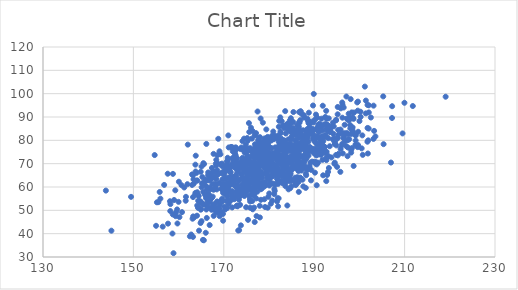
| Category | Series 0 |
|---|---|
| 181.97354789290594 | 63.013 |
| 174.14995070958344 | 69.719 |
| 190.10420089350603 | 84.557 |
| 165.58429628779334 | 37.166 |
| 183.79218251577453 | 74.781 |
| 199.11801189327667 | 78.111 |
| 182.34821796358167 | 75.949 |
| 166.06781007941893 | 55.224 |
| 172.21955185147635 | 71.529 |
| 181.12166712556677 | 82.031 |
| 188.08971407539184 | 74.369 |
| 176.67147041239792 | 75.014 |
| 176.12724490690118 | 67.232 |
| 177.76762304990046 | 78.871 |
| 170.2322964658713 | 68.976 |
| 179.8002262728901 | 78.485 |
| 177.11377312325243 | 64.06 |
| 164.51959254714086 | 41.301 |
| 171.89142333474146 | 55.757 |
| 186.341624362635 | 71.644 |
| 187.97718547556184 | 73.834 |
| 177.0613540110579 | 70.189 |
| 158.08883387889315 | 53.896 |
| 203.2528463055293 | 84.05 |
| 175.3363432921299 | 76.392 |
| 181.52351085125727 | 68.783 |
| 169.47795082283443 | 54.198 |
| 179.49615841966119 | 71.707 |
| 176.81316132929575 | 62.189 |
| 161.6260778254142 | 55.792 |
| 177.46580289804268 | 62.531 |
| 192.3760925088205 | 81.652 |
| 182.4824727362719 | 71.401 |
| 183.82412955635132 | 65.702 |
| 166.8694273245503 | 43.688 |
| 193.64703581521889 | 83.72 |
| 174.5317418045996 | 76.63 |
| 180.0954592631937 | 60.617 |
| 195.20480212521773 | 94.289 |
| 187.07859763612976 | 76.657 |
| 163.1836699357596 | 38.631 |
| 183.611178952201 | 74.365 |
| 179.49417944523756 | 66.181 |
| 187.1671307468754 | 67.056 |
| 166.79814510377537 | 59.272 |
| 193.21904902728502 | 89.411 |
| 186.62713798185666 | 78.523 |
| 186.60246564266677 | 74.022 |
| 187.7255086124208 | 70.364 |
| 169.2003149410633 | 48.616 |
| 181.33686999143865 | 68.938 |
| 188.13335611553208 | 59.615 |
| 187.5993801998575 | 77.44 |
| 185.02109364987462 | 81.558 |
| 194.83785217077607 | 88.763 |
| 165.5062783534685 | 52.435 |
| 186.3317664930049 | 67.532 |
| 197.98914330262537 | 85.115 |
| 163.71424924664817 | 69.575 |
| 175.88359671482831 | 62.733 |
| 166.8627958726451 | 51.063 |
| 179.3672886638749 | 72.826 |
| 174.4282270987444 | 66.245 |
| 174.33156028091855 | 57.456 |
| 177.18089270137753 | 67.468 |
| 171.0934123063694 | 76.948 |
| 188.78895807210134 | 85.162 |
| 176.21125178059845 | 80.734 |
| 184.35972073671533 | 87.225 |
| 174.18685212004797 | 68.416 |
| 190.06841809389147 | 75.535 |
| 166.00850272923654 | 40.388 |
| 192.91268764961495 | 86.608 |
| 185.77885879833067 | 63.997 |
| 194.50028015979996 | 79.414 |
| 196.4695801136942 | 80.98 |
| 175.41840264180317 | 75.7 |
| 176.96169364276082 | 82.133 |
| 182.85521106647437 | 76.136 |
| 171.85097171718488 | 51.225 |
| 171.83471113657671 | 77.06 |
| 165.09863208399656 | 59.875 |
| 168.3077956530019 | 69.175 |
| 170.24572079237737 | 58.195 |
| 191.43159318717753 | 80.528 |
| 192.2526117852961 | 86.828 |
| 175.1043217785638 | 69.487 |
| 177.52486780659268 | 65.793 |
| 180.5127691883527 | 72.915 |
| 172.2066417314072 | 55.553 |
| 174.22899819430484 | 71.979 |
| 202.54114328594625 | 89.777 |
| 180.15496945891843 | 70.484 |
| 171.9492023866897 | 61.548 |
| 170.13073679468133 | 65.104 |
| 163.22432391907486 | 47.4 |
| 160.63628582604824 | 60.792 |
| 180.14791048324426 | 67.623 |
| 192.6642535363213 | 81.503 |
| 158.87269602132716 | 31.623 |
| 186.99997110929755 | 68.911 |
| 188.2268129000617 | 77.089 |
| 170.82664227112352 | 70.806 |
| 199.72478035711532 | 83.663 |
| 174.58551753719638 | 67.839 |
| 183.03047019476935 | 61.62 |
| 182.64663741240827 | 72.663 |
| 182.13708943742697 | 65.72 |
| 177.31143037716882 | 66.045 |
| 187.58833056554158 | 79.414 |
| 177.43514492806628 | 58.024 |
| 178.9830011868753 | 70.501 |
| 176.92343652566217 | 57.493 |
| 186.79072814638477 | 75.561 |
| 183.27120646894616 | 79.984 |
| 176.34534825756748 | 66.999 |
| 188.9828900575242 | 77.095 |
| 186.9070321809714 | 73.19 |
| 194.9002355756308 | 77.821 |
| 188.13827042004877 | 75.361 |
| 191.62746637065996 | 86.402 |
| 189.41410326868564 | 76.489 |
| 178.60198627663144 | 61.701 |
| 170.0834961872981 | 67.019 |
| 172.52089961712616 | 74.016 |
| 163.0918025544092 | 46.414 |
| 186.28651476743187 | 86.358 |
| 184.20180854828797 | 62.594 |
| 168.54800011402597 | 51.178 |
| 172.92095962593075 | 68.876 |
| 173.62965290141545 | 59.185 |
| 198.51182084812137 | 89.826 |
| 184.5226898494242 | 63.225 |
| 185.50715143794906 | 75.918 |
| 164.89839388885957 | 50.278 |
| 192.68627289729196 | 85.117 |
| 189.66281333671785 | 80.638 |
| 198.5045818606398 | 83.725 |
| 188.38377453910542 | 82.601 |
| 184.23376816446165 | 70.048 |
| 179.4660025153256 | 71.403 |
| 172.73965730514516 | 64.502 |
| 181.38871805663138 | 67.773 |
| 168.6529320576522 | 65.265 |
| 177.29844431923138 | 68.167 |
| 170.9366224148731 | 59.159 |
| 189.25635069166307 | 76.355 |
| 166.0608476109619 | 56.44 |
| 177.28793973308382 | 75.341 |
| 183.2927277147668 | 73.33 |
| 182.97368232696815 | 71.901 |
| 188.31704895742635 | 80.188 |
| 168.55547800702314 | 67.193 |
| 175.52345158072904 | 56.344 |
| 163.19521524496434 | 55.685 |
| 177.4725360817185 | 92.352 |
| 183.1442770736051 | 72.228 |
| 166.96373141652398 | 59.755 |
| 186.05993014153168 | 68.321 |
| 165.04057254171488 | 53.039 |
| 171.05944445217776 | 63.999 |
| 188.22041083606558 | 67.786 |
| 197.510754904832 | 82.617 |
| 183.3875197582739 | 67.365 |
| 163.72867772648655 | 57.503 |
| 166.24453499200402 | 58.913 |
| 178.55140390711628 | 59.66 |
| 180.80361457864433 | 65.368 |
| 176.67360263485287 | 62.339 |
| 170.93920287061712 | 54.15 |
| 192.75208734051813 | 89.186 |
| 180.56340628585232 | 72.319 |
| 173.60587413918338 | 67.972 |
| 163.42607429925567 | 46.985 |
| 173.58956569877822 | 56.09 |
| 176.5375734695489 | 74.361 |
| 197.3791570539337 | 73.204 |
| 162.49896050866815 | 38.865 |
| 166.5438945285511 | 66.236 |
| 186.5433607519876 | 85.711 |
| 187.59837584663146 | 60.262 |
| 197.94586536501416 | 86.53 |
| 184.56328846277842 | 78.385 |
| 186.25072006119206 | 82.783 |
| 176.84498690714625 | 58.262 |
| 183.60013329871157 | 76.844 |
| 173.9280881436855 | 63.655 |
| 170.84156721409636 | 61.736 |
| 182.30578874648 | 80.533 |
| 177.99079023994608 | 76.491 |
| 174.5061338886868 | 68.618 |
| 181.1845736318157 | 73.371 |
| 159.2692347506479 | 58.58 |
| 176.84664041567345 | 82.161 |
| 191.0780947830674 | 83.627 |
| 176.7737561483839 | 64.398 |
| 180.99130419261323 | 74.62 |
| 185.020962706067 | 70.237 |
| 175.283080668355 | 71.64 |
| 180.72740614268528 | 80.704 |
| 190.73182441557861 | 73.846 |
| 186.5252327682691 | 62.151 |
| 171.75600703217245 | 56.483 |
| 180.41541734090987 | 52.86 |
| 182.0367375418925 | 61.337 |
| 181.45615468937743 | 67.097 |
| 180.12337489301228 | 63.222 |
| 186.30354530315725 | 75.368 |
| 173.3528784258058 | 54.591 |
| 167.3144928459577 | 65.842 |
| 179.6527948001129 | 65.01 |
| 201.80293170218252 | 95.16 |
| 169.14343194806122 | 52.433 |
| 162.97683515708127 | 65.393 |
| 187.3090020763238 | 79.413 |
| 186.99445340533745 | 76.171 |
| 179.67353555904936 | 68.197 |
| 168.2288450751136 | 60.538 |
| 183.3700653505635 | 65.284 |
| 176.36091311402743 | 83.997 |
| 175.27876968248165 | 72.466 |
| 184.02493435331604 | 87.029 |
| 171.6390981173012 | 57.917 |
| 171.3591068967907 | 62 |
| 170.62247133263733 | 53.983 |
| 185.847199154798 | 60.878 |
| 174.91336681215546 | 58.692 |
| 190.18272608270587 | 88.863 |
| 173.0452230944202 | 60.793 |
| 180.76266887011394 | 67.743 |
| 177.80839871419317 | 76.365 |
| 195.21744885173567 | 73.539 |
| 200.64486228649653 | 82.121 |
| 177.33043837611882 | 72.837 |
| 159.74783214862296 | 44.369 |
| 174.5473763512999 | 69.197 |
| 188.20480690613255 | 77.721 |
| 193.8243595508622 | 72.665 |
| 186.86875785672737 | 83.518 |
| 172.13679122637618 | 72.436 |
| 185.23006839441672 | 77.55 |
| 186.28070773134417 | 75.222 |
| 184.30043100929367 | 72.729 |
| 172.67420542811863 | 64.674 |
| 178.17983768786092 | 77.649 |
| 176.16488670080852 | 68.309 |
| 186.92939691463465 | 88.663 |
| 172.87374854773546 | 56.572 |
| 191.90436995285688 | 84.219 |
| 193.13767991786628 | 73.234 |
| 187.321002470562 | 69.544 |
| 162.97999763590389 | 60.872 |
| 190.7538538250195 | 75.862 |
| 190.39357914965925 | 91.034 |
| 199.1734573122805 | 82.135 |
| 172.1172648783725 | 68.812 |
| 181.70864888780105 | 63.619 |
| 180.89600364386118 | 61.452 |
| 179.65680376705316 | 70.693 |
| 180.0549317796463 | 57.227 |
| 154.7083328621699 | 73.688 |
| 178.01996366355132 | 69.101 |
| 165.45469970499667 | 57.95 |
| 173.71584200692834 | 69.827 |
| 183.52250865321375 | 64.135 |
| 177.17062989825442 | 55.103 |
| 179.65469430179397 | 68.976 |
| 179.2197013006953 | 68.075 |
| 195.3037803395607 | 84.423 |
| 183.07862412666947 | 68.209 |
| 179.4708951270984 | 69.141 |
| 169.25774007411482 | 74.022 |
| 179.32330654505526 | 60.773 |
| 166.50326513608277 | 55.448 |
| 181.08160380074924 | 66.379 |
| 164.07068644402864 | 47.703 |
| 190.72988267073382 | 78.16 |
| 185.07263906728915 | 80.478 |
| 162.7942380401222 | 39.628 |
| 189.9039982664904 | 99.889 |
| 187.677830254291 | 77.473 |
| 175.7884092223019 | 70.868 |
| 181.93189817249146 | 55.187 |
| 185.3784959116953 | 76.569 |
| 171.67659170575135 | 57.566 |
| 191.21634706549688 | 87.139 |
| 194.83247100990775 | 88.582 |
| 172.64069631615862 | 73.383 |
| 155.81800967401242 | 57.869 |
| 184.92514284844927 | 68.11 |
| 185.40484343000554 | 87.745 |
| 200.74552899834148 | 73.773 |
| 184.2461690937148 | 84.606 |
| 187.08369437671732 | 72.97 |
| 186.59164477203385 | 57.902 |
| 177.78407060104982 | 60.828 |
| 179.90195658554498 | 70.244 |
| 184.84010090877646 | 89.476 |
| 177.50849804525703 | 68.148 |
| 200.01459327382082 | 88.251 |
| 170.2210962857182 | 59.278 |
| 183.42004934884318 | 85.174 |
| 177.94509762320132 | 51.939 |
| 170.81656483056108 | 67.973 |
| 185.3083944334373 | 75.381 |
| 166.53905369211495 | 65.087 |
| 167.54946319388304 | 52.475 |
| 194.24258430399948 | 82.798 |
| 164.92912548539044 | 50.558 |
| 178.0395119419148 | 70.46 |
| 184.72793524027836 | 83.73 |
| 203.54372404320293 | 81.674 |
| 162.0337889272629 | 78.164 |
| 177.4319772030003 | 73.239 |
| 179.25946527463174 | 80.709 |
| 191.0788917024414 | 78.344 |
| 169.58636189652717 | 70.031 |
| 187.72360092180983 | 71.725 |
| 205.2718721911265 | 98.828 |
| 189.54183869230607 | 70.876 |
| 182.54667322624744 | 71.283 |
| 160.18929430497195 | 47.111 |
| 175.7855112728111 | 54.837 |
| 178.49301535096464 | 63.885 |
| 188.98978259152713 | 87.028 |
| 182.3358460151961 | 67.196 |
| 172.44014013505517 | 63.312 |
| 180.5729519171712 | 72.109 |
| 185.85390866190446 | 76.326 |
| 176.8217457676384 | 59.12 |
| 155.97268299825825 | 55.004 |
| 194.11295546742548 | 80.492 |
| 185.63395430745678 | 73.469 |
| 190.13588043943497 | 80.575 |
| 176.45321689115548 | 58.924 |
| 187.02522611885857 | 63.679 |
| 179.4076182369882 | 84.677 |
| 173.70688156699597 | 56.704 |
| 183.4267353347807 | 79.886 |
| 176.69866391890113 | 66.492 |
| 174.0933414424556 | 68.548 |
| 171.3900544566973 | 68.181 |
| 172.5391958033772 | 69.177 |
| 186.38111425655256 | 86.43 |
| 165.48149908948935 | 52.628 |
| 174.88974788560012 | 70.75 |
| 181.98189745514816 | 61.851 |
| 179.77053614378354 | 80.148 |
| 176.47961708856366 | 76.1 |
| 176.75258238262353 | 66.669 |
| 180.41398688104084 | 71.112 |
| 169.8105523678185 | 48.457 |
| 155.52479407206755 | 53.515 |
| 184.75832380450439 | 80.77 |
| 177.10023530768328 | 63.813 |
| 181.87670782035187 | 68.027 |
| 171.8884358924832 | 58.222 |
| 199.3257897804893 | 77.818 |
| 194.34048101520779 | 85.947 |
| 165.47987425979633 | 70.213 |
| 187.72355509089016 | 90.735 |
| 177.3393228933216 | 77.661 |
| 183.90405238822595 | 78.371 |
| 196.06552562348125 | 82.955 |
| 169.06746166529564 | 47.514 |
| 182.10863426155515 | 71.108 |
| 173.70631764549327 | 69.701 |
| 149.47845041724872 | 55.778 |
| 172.13595097369884 | 61.032 |
| 177.51637803037752 | 77.041 |
| 172.45992204205632 | 69.94 |
| 189.74204635450687 | 94.927 |
| 175.31670100815114 | 76.4 |
| 188.73547874955125 | 73.414 |
| 170.9691949569067 | 71.823 |
| 155.0151324567814 | 43.371 |
| 191.85158464225387 | 77.286 |
| 185.41602819605956 | 85.131 |
| 197.1213675649882 | 98.775 |
| 192.9547744036262 | 83.759 |
| 197.75823648789975 | 88.775 |
| 193.11032686374662 | 80.932 |
| 189.6185140703696 | 84.952 |
| 184.3675965785286 | 75.967 |
| 181.8493089988599 | 75.625 |
| 175.34756466253265 | 64.66 |
| 172.98763991891056 | 52.101 |
| 188.2240272212764 | 65.05 |
| 178.94617335605378 | 79.617 |
| 186.56368385178465 | 74.01 |
| 174.14189702782883 | 72.51 |
| 198.05547807572114 | 89.427 |
| 185.987536451369 | 76.998 |
| 189.24205932802388 | 84.655 |
| 190.30926318144384 | 74.104 |
| 169.81070426715374 | 61.302 |
| 179.00418390562248 | 71.226 |
| 177.86829630344758 | 73.382 |
| 170.3769405052765 | 57.743 |
| 173.05868638380153 | 51.719 |
| 173.56889144923394 | 57.257 |
| 184.60528762663307 | 88.522 |
| 182.24135243566332 | 73.741 |
| 176.8384264615343 | 44.986 |
| 178.50881996381622 | 73.29 |
| 175.46272882174497 | 67.659 |
| 183.5850724752515 | 92.511 |
| 161.573024659896 | 54.115 |
| 180.0834820364373 | 61.52 |
| 175.08512940028845 | 72.303 |
| 194.70197431403537 | 79.991 |
| 197.79187282374798 | 89.748 |
| 196.33111911931212 | 74.392 |
| 173.60595331600678 | 52.347 |
| 185.6137031023431 | 74.748 |
| 195.43135636751833 | 74.312 |
| 172.4224270974504 | 60.8 |
| 186.4639874964703 | 73.287 |
| 176.23390988157024 | 73.341 |
| 184.06432437197338 | 64.507 |
| 186.75497406918075 | 69.02 |
| 171.8345382157953 | 57.522 |
| 179.697441532246 | 81.466 |
| 198.1765999355138 | 74.73 |
| 191.83683145557228 | 71.618 |
| 165.16598649123756 | 61.573 |
| 188.65924590805056 | 88.267 |
| 177.58972723060762 | 79.989 |
| 171.00088527442273 | 82.106 |
| 188.0983874081094 | 71.73 |
| 170.4933257949958 | 58.04 |
| 168.21831874132454 | 66.354 |
| 205.35403294309873 | 78.357 |
| 194.56215976309323 | 78.415 |
| 158.71517909811942 | 48.237 |
| 169.65346525910243 | 55.003 |
| 196.73962332262522 | 86.638 |
| 172.85792882414302 | 76.199 |
| 175.30375557098094 | 72.066 |
| 192.26960229047396 | 77.075 |
| 171.4663567527292 | 64.087 |
| 171.9516044469881 | 76.544 |
| 192.65600404080544 | 92.629 |
| 174.16814816271312 | 71.527 |
| 195.1905649951385 | 91.153 |
| 188.01849336644588 | 82.183 |
| 189.78851778470883 | 87.68 |
| 180.83956505298363 | 67.156 |
| 160.06511613860974 | 62.254 |
| 186.28214980157688 | 64.211 |
| 165.07874357264646 | 68.768 |
| 169.4097360202236 | 65.982 |
| 172.31637970567604 | 64.24 |
| 178.00835594442796 | 81.339 |
| 190.7652113003607 | 81.725 |
| 182.5178577106952 | 71.77 |
| 185.5543265553512 | 75.696 |
| 192.69594762713635 | 71.516 |
| 184.64385009909464 | 65.262 |
| 174.00168687229416 | 63.827 |
| 175.69028871853197 | 66.937 |
| 171.24972826064914 | 53.73 |
| 166.9685791235427 | 58.963 |
| 190.76600434742298 | 78.102 |
| 179.06275460174075 | 76.17 |
| 173.78036248218007 | 43.559 |
| 197.74894185348685 | 80.501 |
| 188.1276943198972 | 76.13 |
| 186.09502086781907 | 75.528 |
| 175.5166700408429 | 60.402 |
| 187.5149710959164 | 79.635 |
| 177.09596957080421 | 73.779 |
| 169.82097662173288 | 58.609 |
| 193.24924950887075 | 68.151 |
| 175.02024556133912 | 63.895 |
| 184.32325142028307 | 58.992 |
| 186.23178738726156 | 75.676 |
| 172.7283684352264 | 60.664 |
| 174.75097987768032 | 61.201 |
| 185.27110040128497 | 72.81 |
| 172.14661930578146 | 70.678 |
| 167.9367468101329 | 59.219 |
| 178.97798437017806 | 71.79 |
| 186.10330802335457 | 74.297 |
| 190.651791263891 | 89.761 |
| 185.28581444170382 | 83.945 |
| 199.13605920449996 | 82.143 |
| 181.9934296083207 | 64.543 |
| 177.24533470513393 | 47.523 |
| 180.02017122089575 | 74.338 |
| 191.53742295327905 | 85.68 |
| 197.09458479186307 | 77.504 |
| 182.89426293741886 | 79.721 |
| 182.2557112949539 | 88.336 |
| 192.85720303616324 | 65.143 |
| 172.71312888964198 | 70.618 |
| 175.36395060412622 | 45.915 |
| 183.02896238670712 | 86.102 |
| 164.2971664191471 | 51.094 |
| 186.95372176067895 | 69.064 |
| 177.85971909584669 | 80.811 |
| 195.84676142858507 | 76.317 |
| 190.8478772617753 | 70.448 |
| 182.0741159654198 | 74.09 |
| 185.45187220529584 | 71.456 |
| 173.9470161418551 | 57.446 |
| 193.47967951122854 | 83.537 |
| 185.14089425319008 | 67.494 |
| 167.01929893261385 | 63.823 |
| 173.19686637375708 | 41.353 |
| 176.5471620027266 | 72.609 |
| 195.78844027356018 | 66.489 |
| 185.94703209711852 | 80.097 |
| 183.04427508415975 | 71.891 |
| 199.63978916832838 | 92.729 |
| 185.91217659669505 | 76.871 |
| 188.49394937038082 | 74.475 |
| 170.82205303332427 | 55.795 |
| 176.74003446679222 | 68.982 |
| 179.79712272838242 | 64.97 |
| 183.90703987358455 | 64.157 |
| 173.64412014666223 | 70.343 |
| 174.68903828409654 | 69.796 |
| 176.64372528744948 | 70.735 |
| 169.5826095674232 | 49.233 |
| 182.80797835882754 | 70.548 |
| 177.475632320492 | 62.828 |
| 176.24793960314565 | 64.877 |
| 184.6719322361535 | 71.974 |
| 191.52117906220371 | 74.365 |
| 175.1900246186769 | 80.987 |
| 201.80106177724875 | 85.305 |
| 188.91501008741585 | 83.794 |
| 165.07225281412872 | 45.354 |
| 190.45351162804553 | 73.519 |
| 186.59033239782235 | 63.399 |
| 201.4337207845293 | 97.04 |
| 184.4162027038328 | 70.988 |
| 177.39020096177205 | 65.588 |
| 182.38598163389307 | 65.744 |
| 177.9976236853165 | 70.466 |
| 182.01197822450723 | 51.705 |
| 171.220445272559 | 68.579 |
| 185.18138503510477 | 77.218 |
| 178.60640046789507 | 74.425 |
| 174.6287253034293 | 67.264 |
| 196.0746380297447 | 77.809 |
| 186.28217902110518 | 74.117 |
| 176.88167975051837 | 75.152 |
| 202.07748791212148 | 91.94 |
| 197.48252523771467 | 80.141 |
| 183.84032292944113 | 76.066 |
| 185.36901912953232 | 82.318 |
| 160.75184247475045 | 49.226 |
| 194.8480311466613 | 73.747 |
| 167.03315509253588 | 63.117 |
| 181.15265366701996 | 65.702 |
| 181.18015234250052 | 59.089 |
| 188.81691835838163 | 91.851 |
| 177.8786362141469 | 74.446 |
| 184.17839859726513 | 67.484 |
| 186.53962512620552 | 78.438 |
| 171.97666388726694 | 75.309 |
| 172.59054299170742 | 68.055 |
| 186.08599531018663 | 76.761 |
| 177.89545203369744 | 76.943 |
| 174.60750295314057 | 67.667 |
| 174.87580554911878 | 57.784 |
| 169.05412638583846 | 50.863 |
| 180.7499107725849 | 70.122 |
| 176.70522630396687 | 69.832 |
| 177.13909402154263 | 83.082 |
| 188.7632344005868 | 88.278 |
| 178.6322637524651 | 65.755 |
| 197.16614500308168 | 83.158 |
| 166.00950391758113 | 62.626 |
| 170.85298244989076 | 60.053 |
| 191.41643040978263 | 78.303 |
| 175.8406609584416 | 76.646 |
| 180.6515265997721 | 64.434 |
| 181.37135940650617 | 67.63 |
| 175.5859526380121 | 61.612 |
| 190.11783787756468 | 76.422 |
| 199.6756975365422 | 96.595 |
| 170.41415239127986 | 63.603 |
| 187.00354254708134 | 92.418 |
| 199.70910120930694 | 77.977 |
| 183.33263867308293 | 74.962 |
| 176.50092888054576 | 75.189 |
| 189.05236336947488 | 85.35 |
| 167.95155749496885 | 64.467 |
| 168.99901947384254 | 61.891 |
| 181.76559188798933 | 81.045 |
| 179.63664701976597 | 69.364 |
| 176.7820214546536 | 60 |
| 159.43267598160665 | 49.149 |
| 179.74246025906356 | 74.717 |
| 188.6967011015729 | 79.362 |
| 175.65006393519542 | 61.958 |
| 183.1826493972378 | 69.119 |
| 177.73128231780518 | 68.668 |
| 175.91283753928613 | 69.51 |
| 177.7021691846022 | 60.447 |
| 185.0973130020263 | 70.111 |
| 175.53403442041161 | 72.117 |
| 196.84736290683563 | 79.684 |
| 163.9401427736794 | 66.028 |
| 191.2265868345885 | 73.958 |
| 183.51935170779336 | 63.061 |
| 174.46774947034177 | 62.646 |
| 188.86259032714605 | 84.817 |
| 178.96035311170166 | 60.233 |
| 174.8791323655867 | 59.494 |
| 184.74302821265675 | 78.042 |
| 176.4974437656051 | 61.599 |
| 156.806137320706 | 60.887 |
| 182.7505026654495 | 79.449 |
| 198.20069660749516 | 82.732 |
| 172.9711544671196 | 66.238 |
| 194.3664639965318 | 80.654 |
| 164.41476734084796 | 51.213 |
| 175.98057822803867 | 62.756 |
| 183.02965165252095 | 65.471 |
| 190.28237115073114 | 70.088 |
| 184.80664350671665 | 87.47 |
| 198.72695101547757 | 69.01 |
| 186.3891976493437 | 77.747 |
| 178.5453147191909 | 61.606 |
| 178.14883413538786 | 65.875 |
| 187.4662275735531 | 70.501 |
| 171.9344138016779 | 72.386 |
| 170.73825040560487 | 61.308 |
| 183.69745298470514 | 86.325 |
| 186.68592954467493 | 70.738 |
| 198.43361286232673 | 84.47 |
| 188.05845340447743 | 68.695 |
| 183.50800844752905 | 76.109 |
| 186.82078808115585 | 77.333 |
| 173.23106774184737 | 58.126 |
| 184.04588808711642 | 63.714 |
| 191.97651309533356 | 65.014 |
| 178.89107882977396 | 78.949 |
| 164.65926274588062 | 53.983 |
| 174.93664736075107 | 51.332 |
| 191.97684458824938 | 77.723 |
| 173.84612608689298 | 70.594 |
| 193.43994066039556 | 77.469 |
| 179.85454609252463 | 55.79 |
| 180.9653789440704 | 72.787 |
| 183.9279897615957 | 72.769 |
| 171.79722742957466 | 69.592 |
| 170.15258153463355 | 51.539 |
| 190.04263756304002 | 70.763 |
| 172.81670992049297 | 51.838 |
| 178.53313441888093 | 72.638 |
| 181.47697759767516 | 69.592 |
| 179.40466737591618 | 72.518 |
| 168.78039313607826 | 80.649 |
| 185.7473818677844 | 76.389 |
| 203.11569536151998 | 80.607 |
| 184.94848501478634 | 71.113 |
| 171.6044090444605 | 77.16 |
| 188.25455393099529 | 84.057 |
| 170.73701287312846 | 69.519 |
| 174.0057761290811 | 58.828 |
| 182.14860076882482 | 66.2 |
| 167.73988697502614 | 58.815 |
| 175.33753178328536 | 63.288 |
| 172.9335478624939 | 59.794 |
| 188.14420596757546 | 65.701 |
| 181.26217337676607 | 58.285 |
| 171.8186934309374 | 58.001 |
| 166.8140630030504 | 62.876 |
| 167.4794635400647 | 61.221 |
| 176.3519391988281 | 67.304 |
| 166.4699937811967 | 57.146 |
| 166.95439230282932 | 54.285 |
| 194.5544295306143 | 70.426 |
| 189.78875410583956 | 82.404 |
| 179.4314862429418 | 75.249 |
| 175.68521695183443 | 62.191 |
| 176.15465066261862 | 56.774 |
| 175.82531864391294 | 53.815 |
| 182.54196546259647 | 83.805 |
| 185.5581629287187 | 77.214 |
| 184.63474041312213 | 75.466 |
| 181.39208968945695 | 76.986 |
| 191.24967772772507 | 76.178 |
| 167.54913137251614 | 55.876 |
| 167.7692110897603 | 47.612 |
| 168.51818464707785 | 53.8 |
| 170.9412456045992 | 59.857 |
| 198.0687204423654 | 97.663 |
| 177.0260351225073 | 62.539 |
| 157.5927097336574 | 65.688 |
| 166.13777596176757 | 50.363 |
| 175.8976528269908 | 65.594 |
| 185.8135957038037 | 72.246 |
| 177.5448868090699 | 59.893 |
| 182.57686136077766 | 76.08 |
| 190.32167168133313 | 79.089 |
| 172.67837911785995 | 60.268 |
| 176.05084755071724 | 68.06 |
| 194.6060671008698 | 80.767 |
| 189.60650019674242 | 83.984 |
| 179.49106751629827 | 72.563 |
| 182.38388860923402 | 79.596 |
| 182.14860339758826 | 64.631 |
| 176.47493196062325 | 64.094 |
| 178.6390417344734 | 77.684 |
| 187.86815376351433 | 78.809 |
| 176.69369414601854 | 51.185 |
| 186.89476700932823 | 64.026 |
| 192.52722283133366 | 86.909 |
| 202.0811472392404 | 95.026 |
| 179.73695071116637 | 74.984 |
| 186.08795422450055 | 82.293 |
| 180.9416359336783 | 83.782 |
| 176.96285824182402 | 61.809 |
| 173.04744689851807 | 68.735 |
| 166.34947874177973 | 51.873 |
| 174.37092557531452 | 58.576 |
| 169.484657987184 | 61.09 |
| 184.8737540315045 | 73.145 |
| 187.77864793617948 | 89.761 |
| 179.01917744740734 | 68.347 |
| 198.71332340328922 | 89.216 |
| 170.72034909109405 | 71.077 |
| 171.47933901543627 | 66.319 |
| 163.17879675151192 | 65.06 |
| 185.91190500974628 | 73.488 |
| 180.5033925244581 | 79.919 |
| 186.52358903453046 | 69.736 |
| 170.73536867020488 | 50.965 |
| 186.39391676611578 | 68.335 |
| 186.60091718189642 | 81.102 |
| 164.86325955893014 | 44.575 |
| 183.09644705260519 | 86.236 |
| 190.40719710370306 | 70.658 |
| 187.54658449761158 | 84.303 |
| 180.5714775671888 | 70.162 |
| 172.6848661657312 | 69.944 |
| 177.32232089785904 | 64.099 |
| 167.94671548652266 | 50.504 |
| 181.8226967592489 | 74.216 |
| 179.54986332109922 | 71.357 |
| 182.818044844423 | 88.19 |
| 175.6728683825882 | 70.797 |
| 169.73755793282126 | 59.732 |
| 191.53211565073613 | 73.792 |
| 176.62474726329074 | 63.583 |
| 179.1287902230587 | 51.423 |
| 176.87946322707688 | 70.386 |
| 159.67813440424763 | 50.386 |
| 169.27494426993408 | 69.689 |
| 166.7633865260896 | 53.492 |
| 174.54507298157404 | 56.149 |
| 196.67496761680408 | 81.672 |
| 170.96052762028964 | 58.029 |
| 185.4363694578859 | 75.641 |
| 177.9079281492508 | 79.355 |
| 193.92865030907058 | 86.085 |
| 183.34421488002442 | 71.16 |
| 170.76253976862063 | 67.353 |
| 180.63237681894162 | 71.107 |
| 181.5222654005331 | 65.483 |
| 191.73893312822184 | 81.762 |
| 182.58293366914654 | 78.847 |
| 172.65337260953896 | 68.25 |
| 179.95081824773249 | 77.329 |
| 182.9106314062569 | 70.049 |
| 180.51505821992583 | 61.552 |
| 182.7703296187591 | 66.561 |
| 178.81452701411678 | 74.605 |
| 183.22889716446295 | 68.172 |
| 187.99799853317168 | 80.593 |
| 193.4856888216478 | 84.542 |
| 165.98752723155334 | 63.237 |
| 186.655647704165 | 76.472 |
| 178.60912440815108 | 69.254 |
| 198.1827091538935 | 75.961 |
| 163.36199433568274 | 61.452 |
| 172.70013495913702 | 56.109 |
| 179.72268807289814 | 51.14 |
| 186.11755774319997 | 75.776 |
| 172.23179163853547 | 61.159 |
| 185.78118060723872 | 62.007 |
| 201.86989024360733 | 74.355 |
| 174.09598951370467 | 60.7 |
| 190.8723444467019 | 85.724 |
| 186.09567295527188 | 70.962 |
| 175.63842703691085 | 83.588 |
| 175.49823964778363 | 59.501 |
| 167.3555143238563 | 55.355 |
| 186.04224083025653 | 69.19 |
| 196.2655607408904 | 95.268 |
| 173.91457431053064 | 65.446 |
| 182.6979775176243 | 80.765 |
| 176.29559385886208 | 63.101 |
| 183.41996525549962 | 71.99 |
| 174.20586018682482 | 70.122 |
| 174.134930972364 | 61.201 |
| 172.19750642390858 | 70.794 |
| 180.7029503949027 | 54.169 |
| 183.72459363620138 | 82.917 |
| 170.4302401500477 | 56.777 |
| 188.02111346607683 | 73.349 |
| 175.03551419375788 | 64.27 |
| 183.5847169444604 | 70.238 |
| 179.9295687229935 | 67.38 |
| 181.83771040577358 | 71.237 |
| 177.02039027672626 | 63.574 |
| 184.12083924539064 | 64.504 |
| 174.37053593493442 | 67.721 |
| 176.88419780879408 | 72.726 |
| 177.69804107462048 | 64.226 |
| 178.2496898689241 | 66.624 |
| 195.83590325665745 | 84.618 |
| 182.16173673015948 | 79.313 |
| 178.64644433103436 | 87.57 |
| 196.24975268177462 | 89.698 |
| 173.89338206710727 | 65.627 |
| 186.06074425537494 | 77.868 |
| 182.67330815595056 | 65.447 |
| 185.96543846223264 | 82.478 |
| 186.98901424334474 | 92.378 |
| 188.45289103062368 | 81.039 |
| 186.74902715089158 | 87.58 |
| 173.92913504968044 | 58.333 |
| 189.1758619352649 | 82.879 |
| 173.3888758465025 | 41.503 |
| 191.1209743430233 | 80.876 |
| 178.63089495755816 | 75.461 |
| 193.72066163005803 | 85.584 |
| 195.22132067588367 | 80.954 |
| 199.17369264939285 | 79.932 |
| 166.2341715565404 | 46.735 |
| 164.3332305059528 | 54.119 |
| 145.1344293956303 | 41.276 |
| 168.77584019380677 | 49.112 |
| 179.35611366713584 | 78.353 |
| 179.0189288655457 | 80.811 |
| 176.6582062478377 | 74.968 |
| 203.1327648158857 | 94.862 |
| 180.5196292579586 | 76.727 |
| 188.13021166102325 | 81.711 |
| 169.6184967149496 | 68.985 |
| 201.77710565055673 | 79.411 |
| 190.11067086977076 | 79.426 |
| 180.50589095345188 | 74.212 |
| 163.2919293677407 | 63.277 |
| 189.6100966995106 | 88.079 |
| 177.62264589604342 | 61.461 |
| 164.44704825063175 | 56.116 |
| 174.30112396540213 | 63.845 |
| 185.55338735504387 | 68.874 |
| 185.82737895870451 | 77.08 |
| 186.56337215748883 | 86.017 |
| 172.49262770460007 | 75.696 |
| 183.47710740992665 | 75.285 |
| 173.72268571627973 | 76.25 |
| 181.67921942079326 | 67.602 |
| 184.9228514360712 | 60.215 |
| 191.13271017717145 | 86.142 |
| 188.4590530679544 | 84.79 |
| 206.98091313915324 | 70.477 |
| 175.81815916525147 | 51.126 |
| 174.8606823859704 | 78.179 |
| 198.31312010710914 | 91.978 |
| 167.73844404815452 | 74.199 |
| 189.08141545404322 | 77.016 |
| 176.75057061944145 | 70.416 |
| 193.0686901114697 | 66.469 |
| 176.68465058055742 | 70.669 |
| 168.2939561148639 | 63.458 |
| 186.671827966533 | 87.791 |
| 197.21180883019997 | 89.294 |
| 184.05451039502034 | 52.072 |
| 167.30388994729 | 50.226 |
| 170.32201606749894 | 50.365 |
| 166.06007405722787 | 56.19 |
| 178.75602715617106 | 75.147 |
| 168.0034536542865 | 61.31 |
| 192.66962154762138 | 62.53 |
| 190.90451139362432 | 83.967 |
| 172.6278484275412 | 76.99 |
| 189.16012070687944 | 70.474 |
| 174.3483479860534 | 75.703 |
| 184.29003537184727 | 80.403 |
| 174.0741938423534 | 68.284 |
| 191.89430057040508 | 94.823 |
| 200.28117255209418 | 90.069 |
| 175.53618669623097 | 72.153 |
| 180.66832500222333 | 81.951 |
| 200.2475067737185 | 92.255 |
| 177.98313991948422 | 46.948 |
| 184.25974025833855 | 85.824 |
| 192.31837825042138 | 77.228 |
| 171.4744729310352 | 61.307 |
| 185.78910273022208 | 78.265 |
| 157.65828495834688 | 44.303 |
| 167.19905990644156 | 55.051 |
| 174.16617253141226 | 68.328 |
| 179.55805403867944 | 78.156 |
| 177.66131555667536 | 67.34 |
| 187.43567164828374 | 68.049 |
| 176.98602138627982 | 67.926 |
| 183.3284174981778 | 78.51 |
| 171.5053589473277 | 64.454 |
| 188.348834603597 | 80.909 |
| 182.88589113868872 | 69.302 |
| 189.00379957707563 | 83.299 |
| 173.7432225662697 | 56.752 |
| 174.2351193394416 | 58.074 |
| 165.2537212847656 | 64.275 |
| 173.35477125986927 | 62.922 |
| 176.5150065959596 | 69.188 |
| 192.99425372974292 | 86.485 |
| 174.12534780019055 | 79.672 |
| 168.48673553108813 | 70.338 |
| 176.2830033362118 | 53.974 |
| 181.32799139174023 | 68.359 |
| 172.1483335489702 | 64.23 |
| 184.558749541963 | 67.023 |
| 169.68927414160626 | 63.294 |
| 184.80761103092726 | 85.313 |
| 178.2164784877532 | 61.476 |
| 178.92228265386325 | 77.43 |
| 177.24890076930916 | 76.119 |
| 186.51280898531354 | 66.854 |
| 177.80886122978296 | 71.56 |
| 169.5609311839323 | 54.448 |
| 192.6791235124133 | 72.454 |
| 186.0136750450751 | 61.025 |
| 176.00943601448012 | 85.423 |
| 174.24866237764743 | 71.179 |
| 182.94288890552292 | 62.037 |
| 176.93486167624212 | 72.442 |
| 175.16931343072613 | 65.476 |
| 180.74672341429832 | 80.813 |
| 183.79752917306448 | 64.665 |
| 182.83366654292905 | 76.777 |
| 179.89486001464735 | 63.274 |
| 182.0628637130648 | 72.918 |
| 179.67195072740685 | 68.982 |
| 169.4285476326066 | 59.223 |
| 176.33365568718253 | 61.732 |
| 176.68987893107402 | 56.253 |
| 174.3153369792168 | 60.161 |
| 182.28272708820592 | 76.956 |
| 195.885347590247 | 93.718 |
| 170.57821393835187 | 67.913 |
| 178.24325252099197 | 59.057 |
| 190.87549590584453 | 86.689 |
| 188.50209456762434 | 89.268 |
| 170.87284551156023 | 60.296 |
| 192.74918008112456 | 75.083 |
| 197.46379088043173 | 76.92 |
| 186.14034857527807 | 69.559 |
| 183.64606085222772 | 60.332 |
| 167.83382686637728 | 64.03 |
| 183.11352831032724 | 66.29 |
| 179.65849411615403 | 64.278 |
| 180.04871067334128 | 73.869 |
| 176.81613972153724 | 70.553 |
| 184.98813264545234 | 88.41 |
| 167.25064982387897 | 63.702 |
| 179.483887834911 | 66.706 |
| 180.54816369128972 | 64.923 |
| 192.0023130450911 | 79.667 |
| 161.24313266585585 | 59.795 |
| 181.5177156652976 | 81.723 |
| 176.54117439145162 | 64.507 |
| 181.77434305131214 | 73.232 |
| 187.62810647762282 | 81.903 |
| 192.4532416938332 | 75.059 |
| 182.7840368629404 | 62.481 |
| 170.9567298432392 | 60.272 |
| 178.56273425155328 | 61.552 |
| 180.72121690057148 | 64.705 |
| 188.0392620016959 | 77.081 |
| 164.13590360852393 | 57.751 |
| 180.47972234324374 | 69.781 |
| 166.7246667696661 | 53.797 |
| 175.00774433738115 | 69.603 |
| 169.62067427459613 | 53.731 |
| 182.5825077466489 | 70.958 |
| 175.05521436052035 | 75.261 |
| 166.97093749143596 | 64.33 |
| 201.20491507054794 | 103.031 |
| 188.22331947258868 | 81.812 |
| 181.21930238695566 | 61.079 |
| 183.49800729531844 | 61.309 |
| 164.12456981485056 | 52.065 |
| 182.0191317832827 | 76.843 |
| 183.58530855983892 | 70.014 |
| 184.17525802821098 | 66.633 |
| 181.9289183651222 | 68.267 |
| 173.30562400471985 | 69.099 |
| 181.48666500057118 | 72.272 |
| 167.63209298613722 | 66.628 |
| 176.88888724760494 | 64.35 |
| 184.2701557564945 | 77.034 |
| 179.20174561777935 | 62.324 |
| 178.15131967834316 | 74.548 |
| 167.25388076082285 | 55.492 |
| 181.70241220805462 | 74.402 |
| 175.4536736518886 | 67.593 |
| 179.00425141057963 | 72.004 |
| 181.20461966754485 | 67.706 |
| 182.96711694893511 | 64.539 |
| 168.44397176617224 | 58.957 |
| 189.16682909989453 | 75.42 |
| 179.34726680776484 | 78.78 |
| 190.54993074868565 | 69.684 |
| 171.35866525635146 | 61.225 |
| 177.94510761821542 | 60.348 |
| 182.7135410209874 | 73.569 |
| 191.6173041459317 | 89.281 |
| 159.00398415354152 | 54.424 |
| 179.64593622494712 | 74.118 |
| 186.5904321893585 | 84.949 |
| 167.76416071618956 | 51.199 |
| 182.68328333925908 | 62.521 |
| 207.21657045710197 | 89.571 |
| 165.51776448466566 | 61.483 |
| 187.22091386588195 | 91.333 |
| 170.6909310419924 | 57.182 |
| 185.84349755269287 | 68.203 |
| 172.4620617313016 | 72.348 |
| 155.2072919866585 | 53.441 |
| 182.00820973045597 | 81.944 |
| 182.76958335865342 | 69.605 |
| 198.57341710941347 | 83.512 |
| 164.89471296903952 | 53.755 |
| 173.19727227723496 | 62.55 |
| 166.55880651387372 | 53.726 |
| 177.27566266314327 | 62.911 |
| 186.65049670977936 | 69.248 |
| 182.5582702228112 | 65.654 |
| 178.28432165532337 | 79.057 |
| 188.28485309120603 | 72.32 |
| 198.80642577687118 | 91.922 |
| 197.63082239849345 | 91.423 |
| 190.55449195773207 | 60.745 |
| 186.29626214866096 | 71.255 |
| 170.85889141817395 | 72.52 |
| 192.41400822912328 | 82.125 |
| 181.9188870729235 | 65.371 |
| 182.89562218594955 | 69.803 |
| 187.05595385584112 | 68.571 |
| 166.33346967424285 | 56.075 |
| 178.6810132805736 | 71.271 |
| 172.27442111647545 | 62.601 |
| 196.19944769949183 | 96.228 |
| 178.51984636033467 | 69.974 |
| 185.36056606708584 | 68.355 |
| 175.08254363570813 | 70.658 |
| 182.12373807018812 | 77.352 |
| 158.7477904909647 | 65.623 |
| 171.55375843076158 | 54.329 |
| 171.21566006592525 | 60.951 |
| 179.66816722927183 | 64.029 |
| 185.23285251347747 | 85.187 |
| 190.91878987211004 | 81.186 |
| 179.32915461437472 | 67.65 |
| 189.34144819538383 | 67.317 |
| 182.17912066837044 | 85.799 |
| 167.9505171105168 | 66.447 |
| 184.90459987578942 | 71.732 |
| 209.96646490100727 | 96.089 |
| 171.4543437241584 | 60.962 |
| 176.51177535721646 | 69.885 |
| 183.1338005977265 | 77.319 |
| 176.9776626790618 | 66.277 |
| 171.27984759490215 | 63.611 |
| 188.74383676723386 | 87.395 |
| 190.52734885839442 | 81.787 |
| 179.05464339124674 | 68.383 |
| 191.50429172691173 | 76.314 |
| 181.83134198603804 | 75.695 |
| 168.23997133135663 | 69.996 |
| 165.79168840741903 | 56.747 |
| 184.56378696046443 | 86.671 |
| 164.13971123856385 | 62.788 |
| 179.702700257435 | 66.933 |
| 158.63900116633522 | 40.056 |
| 182.86797559293504 | 72.442 |
| 166.4292775426426 | 53.628 |
| 159.35020021011428 | 47.506 |
| 172.31093784319134 | 54.755 |
| 176.46909979816755 | 69.075 |
| 178.95236857322794 | 69.32 |
| 187.12970225166885 | 78.939 |
| 170.0797377439534 | 61.241 |
| 171.47618896925673 | 66.352 |
| 168.3178186443892 | 61.101 |
| 176.42788785445106 | 73.481 |
| 174.63818120832008 | 74.702 |
| 201.94586909550216 | 79.988 |
| 175.26486549884905 | 79.766 |
| 182.13205051143441 | 55.124 |
| 181.00528794520378 | 74.281 |
| 199.6146299970672 | 77.097 |
| 178.00147144665252 | 72.321 |
| 185.1704634045804 | 77.711 |
| 189.29256890702317 | 62.832 |
| 181.7833141435838 | 53.828 |
| 184.8116047772672 | 62.438 |
| 185.9647396331971 | 84.014 |
| 172.68788853930127 | 76.699 |
| 187.31195305353626 | 81.135 |
| 200.49809041736543 | 76.561 |
| 177.07982617080316 | 65.878 |
| 189.90054071270742 | 74.591 |
| 186.3285274636285 | 71.638 |
| 188.373219083837 | 83.926 |
| 172.00479070150496 | 64.208 |
| 184.78901732331926 | 65.732 |
| 182.0839212428591 | 65.694 |
| 185.80071120898543 | 76.945 |
| 192.49445891292163 | 74.531 |
| 187.67735420476671 | 70.787 |
| 181.0854869694696 | 80.478 |
| 182.5734107138804 | 83.029 |
| 176.51826462584182 | 67.889 |
| 171.0401081801079 | 52.534 |
| 182.64650247242412 | 71.601 |
| 169.83287265035557 | 57.505 |
| 179.34467400559598 | 73.552 |
| 184.92789471521058 | 70.802 |
| 180.66798421278307 | 70.286 |
| 178.2096479961099 | 54.515 |
| 167.3693479123154 | 68.162 |
| 164.01521676912228 | 62.721 |
| 173.86766971012958 | 76.912 |
| 180.3366411139178 | 69.432 |
| 183.49289915151095 | 79.53 |
| 188.5390643383169 | 67.534 |
| 168.60591955542154 | 73.65 |
| 182.5008062239245 | 89.841 |
| 184.71625773295906 | 78.629 |
| 178.36350221563586 | 75.74 |
| 179.81821831713336 | 80.051 |
| 164.3320906702582 | 56.617 |
| 176.18643825763843 | 58.364 |
| 165.38830804874723 | 37.322 |
| 177.97542252309975 | 63.752 |
| 191.46593840122767 | 79.505 |
| 170.4996469333333 | 66.834 |
| 179.09014460312707 | 70.12 |
| 184.8141812505394 | 75.654 |
| 190.65637498155175 | 85.1 |
| 174.99244937654612 | 71.345 |
| 164.8922385443155 | 66.507 |
| 163.79382612755407 | 73.414 |
| 176.9550877359145 | 76.984 |
| 176.81557596204408 | 61.593 |
| 211.8144349944305 | 94.7 |
| 190.1654684274533 | 66.141 |
| 187.0952267689805 | 82.512 |
| 163.7573829005032 | 66.639 |
| 187.77054175886533 | 77.752 |
| 165.6225310073633 | 69.833 |
| 192.25425420762778 | 76.013 |
| 192.1204054754619 | 75.159 |
| 192.44528422113834 | 90.019 |
| 180.51217102116044 | 71.296 |
| 196.5261920465721 | 94.066 |
| 185.40562418366252 | 92.124 |
| 185.53672060966107 | 73.085 |
| 184.2772570947993 | 70.563 |
| 194.46998967213494 | 69.971 |
| 195.05709149277567 | 68.621 |
| 169.04842329396863 | 75.296 |
| 156.48565964769435 | 43.018 |
| 207.2412900536187 | 94.626 |
| 171.5866179089563 | 61.83 |
| 159.9900451266467 | 53.644 |
| 173.00632293268941 | 72.11 |
| 168.3367193245792 | 71.638 |
| 174.48987224793476 | 80.737 |
| 180.82761229891008 | 66.55 |
| 166.1201083093736 | 60.333 |
| 187.02265005039723 | 69.485 |
| 172.97986527648612 | 59.414 |
| 186.66328820750974 | 92.109 |
| 185.42428622112385 | 73.848 |
| 176.30037579419547 | 64.978 |
| 181.15310986485807 | 56.922 |
| 174.52816438496188 | 58.324 |
| 169.8479225967978 | 45.558 |
| 184.70328361571654 | 59.523 |
| 173.190281070697 | 67.124 |
| 172.43559532798253 | 74.573 |
| 175.18419056593356 | 59.308 |
| 176.4081927704331 | 50.448 |
| 181.48215213205535 | 61.098 |
| 175.55426733077826 | 87.389 |
| 188.3069551717662 | 81.286 |
| 183.78735778916433 | 68.217 |
| 188.6867207629956 | 82.127 |
| 176.45056576256323 | 59.81 |
| 177.26707741801516 | 63.931 |
| 168.0532805856642 | 52.773 |
| 189.94554408392776 | 81.026 |
| 192.086839038837 | 81.42 |
| 182.4078111458094 | 78.305 |
| 188.620552347817 | 67.629 |
| 185.4700831103683 | 74.893 |
| 184.54629672433427 | 64.338 |
| 181.9923806699574 | 80.757 |
| 186.3190558251177 | 75.429 |
| 183.93362886571924 | 68.755 |
| 202.05656404279122 | 85.045 |
| 163.72510955968048 | 57.014 |
| 189.24540687766213 | 76.565 |
| 171.09694816955536 | 67.564 |
| 194.16184065514977 | 87.555 |
| 183.66141446770632 | 75.412 |
| 187.70966587256834 | 76.212 |
| 219.08164486349355 | 98.694 |
| 175.2247182033021 | 73.546 |
| 182.21372146204874 | 70.319 |
| 185.39511542117006 | 68.967 |
| 176.05559448123932 | 75.432 |
| 184.96652630835655 | 63.028 |
| 177.11280574677357 | 74.642 |
| 178.97770695530022 | 54.748 |
| 175.00031644794757 | 62.303 |
| 187.76364929022293 | 73.404 |
| 181.48056483616085 | 73.102 |
| 185.98327428845275 | 84.012 |
| 194.65769238258878 | 78.458 |
| 176.88378271571224 | 78.318 |
| 179.3506692879885 | 76.048 |
| 166.1375454819704 | 78.463 |
| 198.49977631806638 | 85.552 |
| 173.0674686405257 | 70.212 |
| 197.5291747565416 | 88.68 |
| 192.82492692893177 | 86.407 |
| 199.51962595319148 | 96.245 |
| 184.3575386681802 | 84.442 |
| 195.31808702662445 | 82.307 |
| 198.34415905902958 | 76.675 |
| 178.04020939307085 | 68.919 |
| 180.21227829229298 | 72.442 |
| 175.3998271163498 | 58.596 |
| 209.5453401051537 | 82.962 |
| 181.90600001943852 | 76.954 |
| 168.2744464245099 | 49.108 |
| 187.41249594569254 | 63.134 |
| 196.2280223154657 | 78.549 |
| 180.65354151043098 | 66.898 |
| 178.31721563683544 | 65.809 |
| 175.69107271737613 | 66.755 |
| 166.73712620506635 | 56.692 |
| 165.7955281478787 | 62.451 |
| 158.16172183840519 | 49.697 |
| 166.41671365504413 | 56.635 |
| 166.65908925834577 | 62.926 |
| 175.25439599161982 | 66.318 |
| 188.97305348639838 | 68.937 |
| 182.15164290632296 | 70.603 |
| 180.40900415655892 | 76.589 |
| 172.4906801455669 | 64.71 |
| 178.1523414559 | 89.356 |
| 201.4285392000733 | 91.556 |
| 185.87047441998698 | 79.939 |
| 143.91044699668782 | 58.461 |
| 171.21037962519551 | 67.307 |
| 172.76534934765334 | 57.858 |
| 158.19005809178284 | 52.674 |
| 178.43361197935243 | 65.032 |
| 170.34290633230134 | 63.349 |
| 178.03169597499985 | 71.036 |
| 161.94495155295212 | 61.203 |
| 177.7765063551775 | 70.028 |
| 179.28015472176287 | 65.84 |
| 174.6406109591547 | 66.739 |
| 196.59904952894826 | 83.048 |
| 179.75371242052145 | 67.914 |
| 177.8287722861842 | 64.369 |
| 188.28785053592034 | 73.522 |